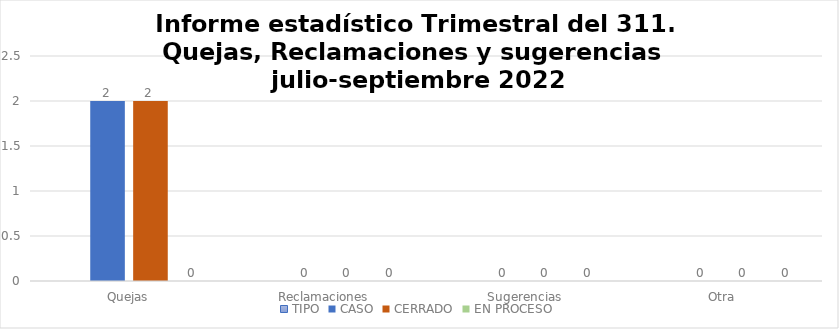
| Category | TIPO | CASO | CERRADO | EN PROCESO |
|---|---|---|---|---|
| Quejas |  | 2 | 2 | 0 |
| Reclamaciones  |  | 0 | 0 | 0 |
| Sugerencias |  | 0 | 0 | 0 |
| Otra |  | 0 | 0 | 0 |